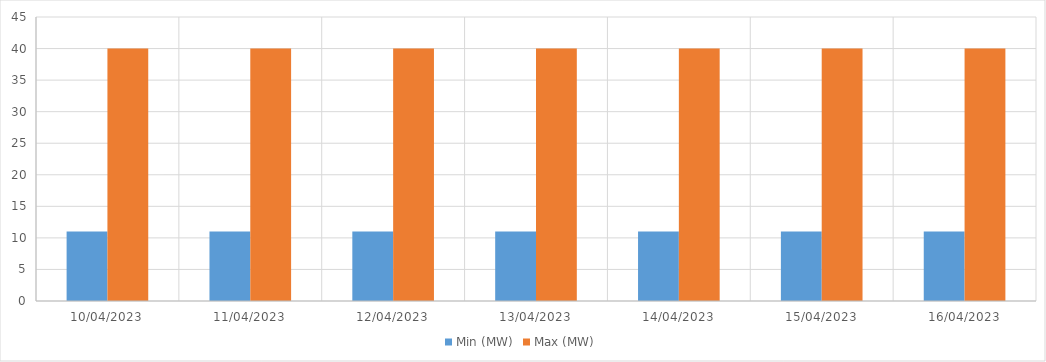
| Category | Min (MW) | Max (MW) |
|---|---|---|
| 10/04/2023 | 11 | 40 |
| 11/04/2023 | 11 | 40 |
| 12/04/2023 | 11 | 40 |
| 13/04/2023 | 11 | 40 |
| 14/04/2023 | 11 | 40 |
| 15/04/2023 | 11 | 40 |
| 16/04/2023 | 11 | 40 |